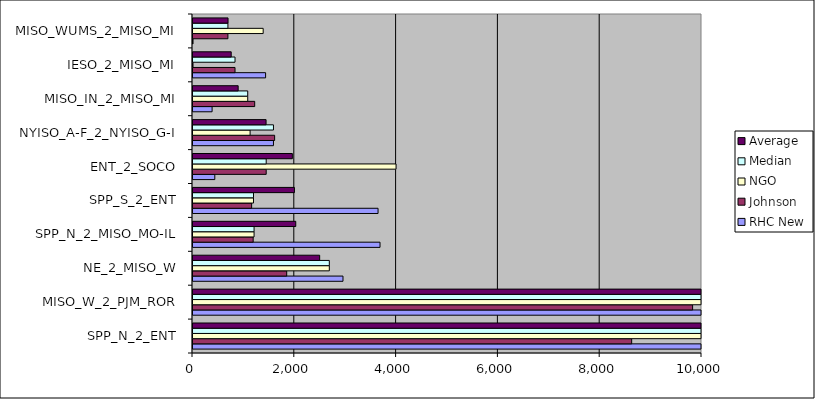
| Category | RHC New | Johnson | NGO | Median | Average |
|---|---|---|---|---|---|
| SPP_N_2_ENT | 18858.715 | 8618.577 | 14051.53 | 14051.53 | 13842.941 |
| MISO_W_2_PJM_ROR | 13776.387 | 9815.673 | 13667.36 | 13667.36 | 12419.807 |
| NE_2_MISO_W | 2946.766 | 1840.952 | 2678.08 | 2678.08 | 2488.599 |
| SPP_N_2_MISO_MO-IL | 3674.373 | 1182.083 | 1199.96 | 1199.96 | 2018.806 |
| SPP_S_2_ENT | 3635.672 | 1151.91 | 1188.38 | 1188.38 | 1991.987 |
| ENT_2_SOCO | 428.29 | 1437.874 | 3989.25 | 1437.874 | 1951.805 |
| NYISO_A-F_2_NYISO_G-I | 1580.727 | 1603.86 | 1121.7 | 1580.727 | 1435.429 |
| MISO_IN_2_MISO_MI | 375.18 | 1212.07 | 1075.12 | 1075.12 | 887.457 |
| IESO_2_MISO_MI | 1426.49 | 825.462 | 0.03 | 825.462 | 750.661 |
| MISO_WUMS_2_MISO_MI | 0.514 | 685.853 | 1378.73 | 685.853 | 688.366 |